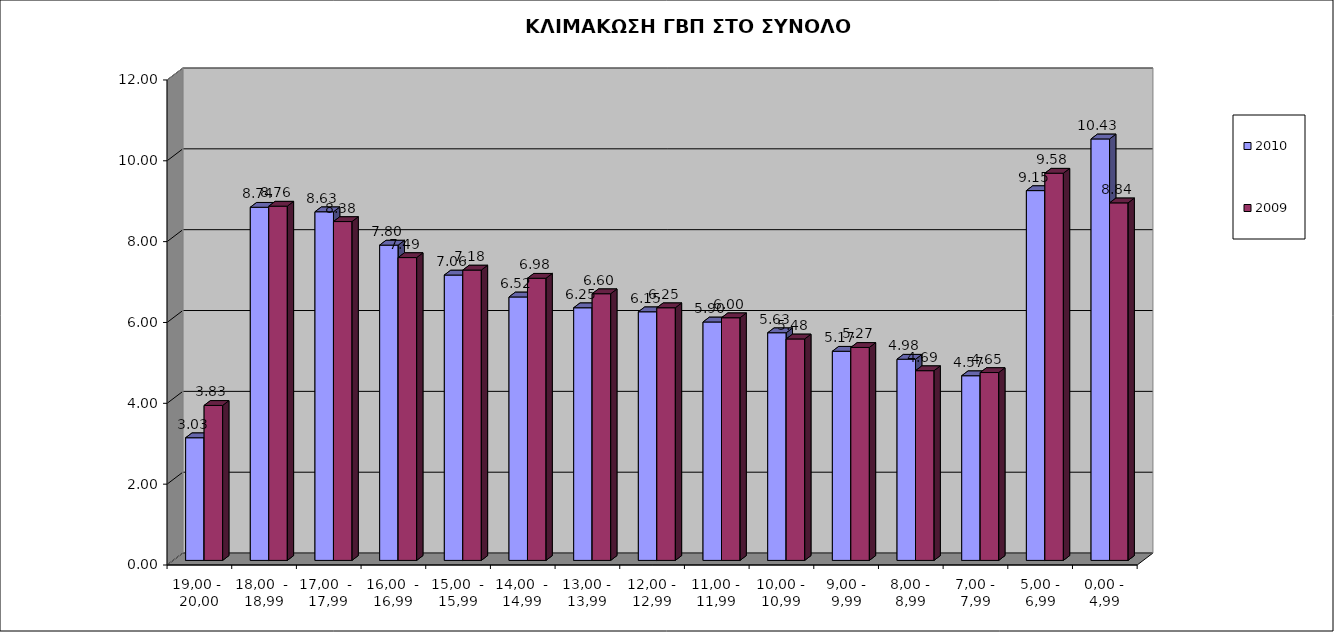
| Category | 2010 | 2009 |
|---|---|---|
| 19,00 -  20,00 | 3.034 | 3.834 |
| 18,00  -  18,99 | 8.737 | 8.764 |
| 17,00  -  17,99 | 8.625 | 8.383 |
| 16,00  - 16,99 | 7.8 | 7.492 |
| 15,00  - 15,99 | 7.06 | 7.183 |
| 14,00  - 14,99 | 6.517 | 6.98 |
| 13,00 - 13,99 | 6.25 | 6.597 |
| 12,00 - 12,99 | 6.151 | 6.251 |
| 11,00 - 11,99 | 5.898 | 6.003 |
| 10,00 - 10,99 | 5.632 | 5.479 |
| 9,00 - 9,99 | 5.174 | 5.269 |
| 8,00 - 8,99 | 4.977 | 4.694 |
| 7,00 - 7,99 | 4.569 | 4.648 |
| 5,00 - 6,99 | 9.149 | 9.579 |
| 0,00 - 4,99 | 10.427 | 8.845 |